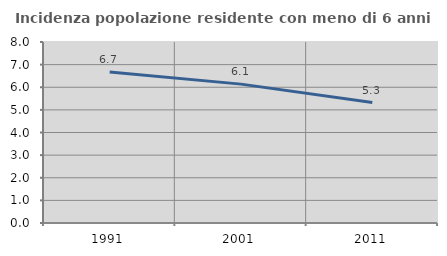
| Category | Incidenza popolazione residente con meno di 6 anni |
|---|---|
| 1991.0 | 6.675 |
| 2001.0 | 6.138 |
| 2011.0 | 5.326 |